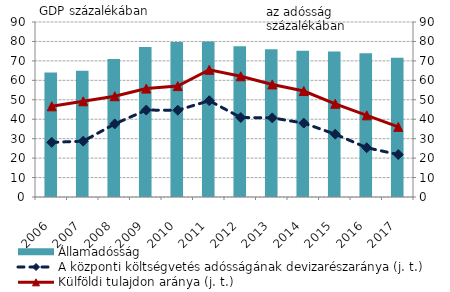
| Category | Államadósság |
|---|---|
| 2006.0 | 64.091 |
| 2007.0 | 64.979 |
| 2008.0 | 70.957 |
| 2009.0 | 77.151 |
| 2010.0 | 79.728 |
| 2011.0 | 79.913 |
| 2012.0 | 77.582 |
| 2013.0 | 75.955 |
| 2014.0 | 75.189 |
| 2015.0 | 74.771 |
| 2016.0 | 73.891 |
| 2017.0 | 71.653 |